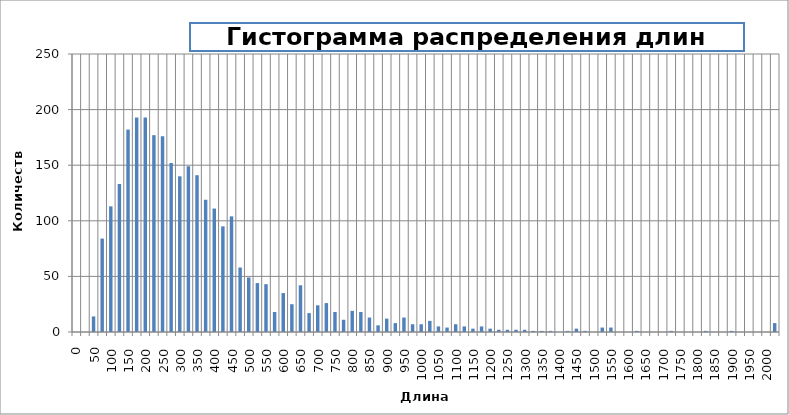
| Category | Series 0 |
|---|---|
| 0.0 | 0 |
| 25.0 | 0 |
| 50.0 | 14 |
| 75.0 | 84 |
| 100.0 | 113 |
| 125.0 | 133 |
| 150.0 | 182 |
| 175.0 | 193 |
| 200.0 | 193 |
| 225.0 | 177 |
| 250.0 | 176 |
| 275.0 | 152 |
| 300.0 | 140 |
| 325.0 | 149 |
| 350.0 | 141 |
| 375.0 | 119 |
| 400.0 | 111 |
| 425.0 | 95 |
| 450.0 | 104 |
| 475.0 | 58 |
| 500.0 | 49 |
| 525.0 | 44 |
| 550.0 | 43 |
| 575.0 | 18 |
| 600.0 | 35 |
| 625.0 | 25 |
| 650.0 | 42 |
| 675.0 | 17 |
| 700.0 | 24 |
| 725.0 | 26 |
| 750.0 | 18 |
| 775.0 | 11 |
| 800.0 | 19 |
| 825.0 | 18 |
| 850.0 | 13 |
| 875.0 | 6 |
| 900.0 | 12 |
| 925.0 | 8 |
| 950.0 | 13 |
| 975.0 | 7 |
| 1000.0 | 7 |
| 1025.0 | 10 |
| 1050.0 | 5 |
| 1075.0 | 4 |
| 1100.0 | 7 |
| 1125.0 | 5 |
| 1150.0 | 3 |
| 1175.0 | 5 |
| 1200.0 | 3 |
| 1225.0 | 2 |
| 1250.0 | 2 |
| 1275.0 | 2 |
| 1300.0 | 2 |
| 1325.0 | 1 |
| 1350.0 | 1 |
| 1375.0 | 1 |
| 1400.0 | 0 |
| 1425.0 | 1 |
| 1450.0 | 3 |
| 1475.0 | 1 |
| 1500.0 | 0 |
| 1525.0 | 4 |
| 1550.0 | 4 |
| 1575.0 | 0 |
| 1600.0 | 0 |
| 1625.0 | 1 |
| 1650.0 | 0 |
| 1675.0 | 0 |
| 1700.0 | 0 |
| 1725.0 | 1 |
| 1750.0 | 0 |
| 1775.0 | 0 |
| 1800.0 | 0 |
| 1825.0 | 1 |
| 1850.0 | 0 |
| 1875.0 | 0 |
| 1900.0 | 1 |
| 1925.0 | 0 |
| 1950.0 | 0 |
| 1975.0 | 0 |
| 2000.0 | 0 |
| 5000.0 | 8 |